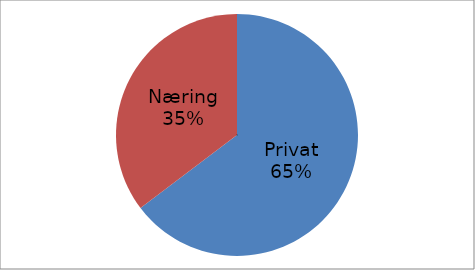
| Category | Series 0 |
|---|---|
| Privat | 36909328 |
| Næring | 20146839 |